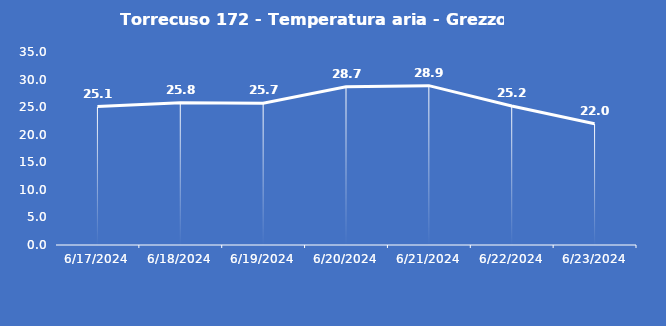
| Category | Torrecuso 172 - Temperatura aria - Grezzo (°C) |
|---|---|
| 6/17/24 | 25.1 |
| 6/18/24 | 25.8 |
| 6/19/24 | 25.7 |
| 6/20/24 | 28.7 |
| 6/21/24 | 28.9 |
| 6/22/24 | 25.2 |
| 6/23/24 | 22 |